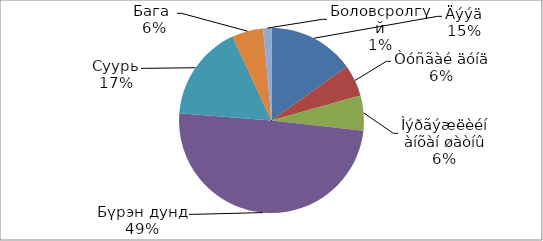
| Category | Series 0 |
|---|---|
| Äýýä | 116 |
| Òóñãàé äóíä | 42 |
| Ìýðãýæëèéí àíõàí øàòíû | 47 |
| Бүрэн дунд | 379 |
| Суурь | 129 |
| Бага  | 42 |
| Боловсролгүй | 11 |